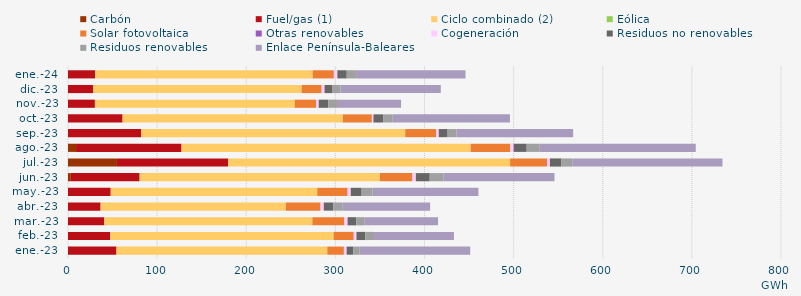
| Category | Carbón | Fuel/gas (1) | Ciclo combinado (2) | Eólica | Solar fotovoltaica | Otras renovables | Cogeneración | Residuos no renovables | Residuos renovables | Enlace Península-Baleares |
|---|---|---|---|---|---|---|---|---|---|---|
| ene.-23 | -0.728 | 54.403 | 236.334 | 0.216 | 18.54 | 0.094 | 3.048 | 7.362 | 7.362 | 123.95 |
| feb.-23 | -0.707 | 47.337 | 250.507 | 0.183 | 22.493 | 0.136 | 3.002 | 9.83 | 9.83 | 89.734 |
| mar.-23 | -0.518 | 40.752 | 233.282 | 0.2 | 35.775 | 0.112 | 3.577 | 9.638 | 9.638 | 82.194 |
| abr.-23 | -0.609 | 36.577 | 207.738 | 0.127 | 38.851 | 0.074 | 3.618 | 10.657 | 10.657 | 98.033 |
| may.-23 | -0.833 | 47.925 | 231.475 | 0.25 | 34.005 | 0.09 | 3.517 | 12.229 | 12.229 | 118.762 |
| jun.-23 | 3.18 | 77.204 | 269.55 | 0.056 | 36.423 | 0.084 | 3.783 | 15.598 | 15.598 | 124.35 |
| jul.-23 | 54.925 | 124.683 | 316.355 | 0.119 | 41.343 | 0.037 | 3.245 | 12.541 | 12.541 | 168.548 |
| ago.-23 | 9.023 | 118.34 | 324.377 | 0.098 | 44.373 | 0.027 | 3.74 | 14.683 | 14.683 | 175.009 |
| sep.-23 | -0.823 | 82.054 | 296.323 | 0 | 34.511 | 0.032 | 3.105 | 9.934 | 9.934 | 130.855 |
| oct.-23 | -0.827 | 61.254 | 247.113 | 0.01 | 32.549 | 0.04 | 1.729 | 10.861 | 10.861 | 131.447 |
| nov.-23 | -0.895 | 30.185 | 224.261 | 0.009 | 23.864 | 0.135 | 2.835 | 10.81 | 10.81 | 70.768 |
| dic.-23 | -0.696 | 28.263 | 233.915 | 0 | 22.335 | 0.126 | 3.21 | 8.992 | 8.992 | 112.44 |
| ene.-24 | -0.706 | 30.444 | 244.02 | 0 | 23.767 | 0.104 | 3.937 | 10.485 | 10.485 | 122.76 |